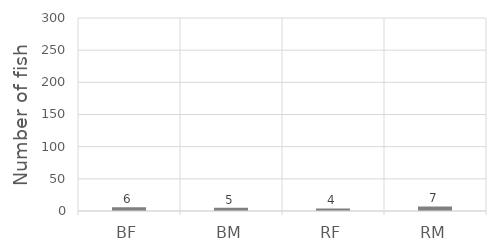
| Category | Series 0 |
|---|---|
| BF | 6 |
| BM | 5 |
| RF | 4 |
| RM | 7 |